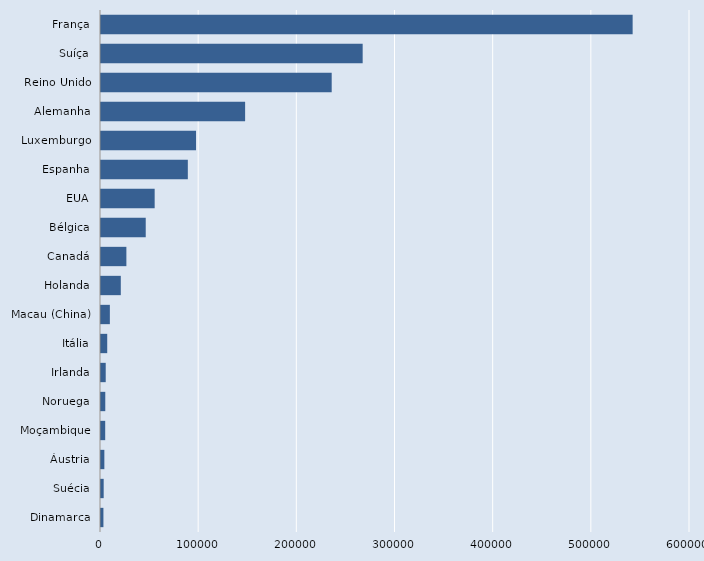
| Category | Series 0 |
|---|---|
| Dinamarca | 2467 |
| Suécia | 2727 |
| Áustria | 3419 |
| Moçambique | 4279 |
| Noruega | 4360 |
| Irlanda | 4807 |
| Itália | 6338 |
| Macau (China) | 9024 |
| Holanda | 20166 |
| Canadá | 25855 |
| Bélgica | 45569 |
| EUA | 54669 |
| Espanha | 88451 |
| Luxemburgo | 96800 |
| Alemanha | 146810 |
| Reino Unido | 235000 |
| Suíça | 266557 |
| França | 541569 |